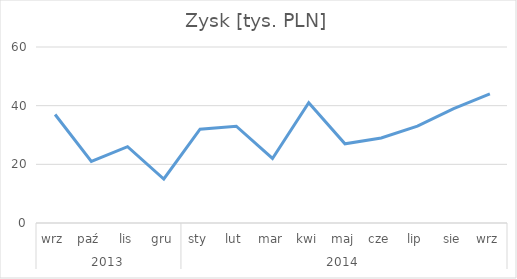
| Category | Zysk [tys. PLN] |
|---|---|
| 0 | 37 |
| 1 | 21 |
| 2 | 26 |
| 3 | 15 |
| 4 | 32 |
| 5 | 33 |
| 6 | 22 |
| 7 | 41 |
| 8 | 27 |
| 9 | 29 |
| 10 | 33 |
| 11 | 39 |
| 12 | 44 |